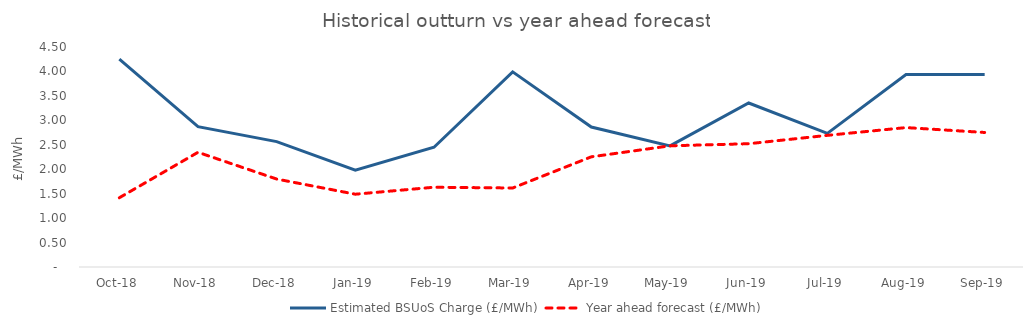
| Category | Estimated BSUoS Charge (£/MWh) | Year ahead forecast (£/MWh) |
|---|---|---|
| Oct-18 | 4.252 | 1.417 |
| Nov-18 | 2.872 | 2.346 |
| Dec-18 | 2.565 | 1.799 |
| Jan-19 | 1.98 | 1.489 |
| Feb-19 | 2.449 | 1.632 |
| Mar-19 | 3.992 | 1.616 |
| Apr-19 | 2.862 | 2.254 |
| May-19 | 2.477 | 2.479 |
| Jun-19 | 3.354 | 2.522 |
| Jul-19 | 2.732 | 2.693 |
| Aug-19 | 3.935 | 2.852 |
| Sep-19 | 3.94 | 2.751 |